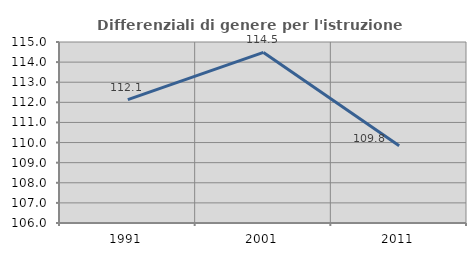
| Category | Differenziali di genere per l'istruzione superiore |
|---|---|
| 1991.0 | 112.132 |
| 2001.0 | 114.482 |
| 2011.0 | 109.838 |